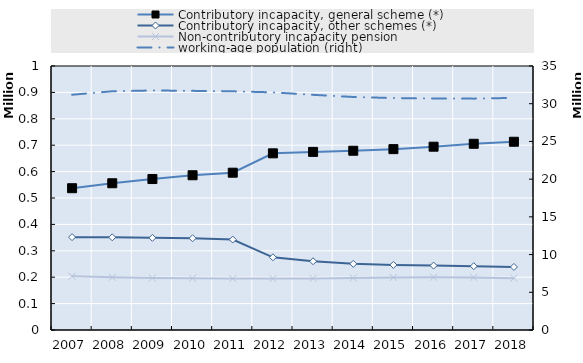
| Category | Contributory incapacity, general scheme (*) | Contributory incapacity, other schemes (*) | Non-contributory incapacity pension |
|---|---|---|---|
| 2007.0 | 537062.083 | 351714.333 | 203401.333 |
| 2008.0 | 555823.417 | 351011.083 | 199409.667 |
| 2009.0 | 571802.667 | 349062.167 | 197136.917 |
| 2010.0 | 586161.75 | 347569.833 | 196159.083 |
| 2011.0 | 595852 | 342638.667 | 194712 |
| 2012.0 | 669208 | 275396.417 | 194876 |
| 2013.0 | 674709.417 | 260510.833 | 195478 |
| 2014.0 | 678988.083 | 250496.417 | 197303 |
| 2015.0 | 685129.417 | 246538.833 | 198891 |
| 2016.0 | 694348 | 243995.75 | 199762 |
| 2017.0 | 705327.833 | 241801.667 | 199120 |
| 2018.0 | 713064.917 | 238773 | 196374.748 |